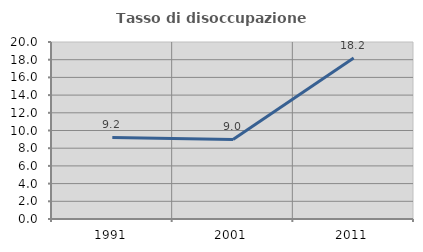
| Category | Tasso di disoccupazione giovanile  |
|---|---|
| 1991.0 | 9.22 |
| 2001.0 | 8.989 |
| 2011.0 | 18.182 |